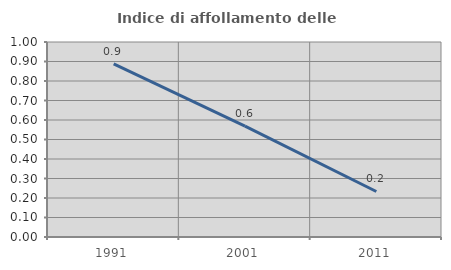
| Category | Indice di affollamento delle abitazioni  |
|---|---|
| 1991.0 | 0.888 |
| 2001.0 | 0.569 |
| 2011.0 | 0.233 |